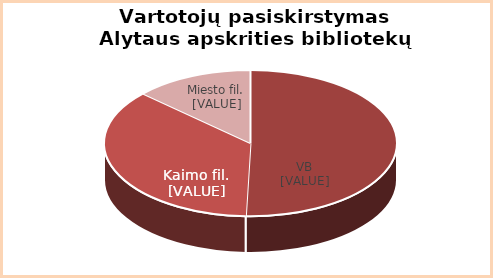
| Category | Series 0 |
|---|---|
| VB | 0.5 |
| KF | 0.36 |
| MF | 0.13 |